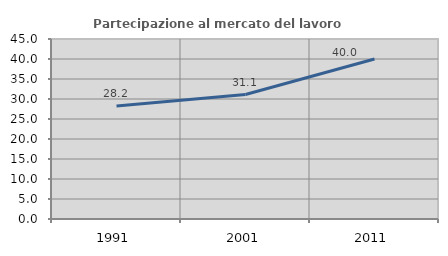
| Category | Partecipazione al mercato del lavoro  femminile |
|---|---|
| 1991.0 | 28.222 |
| 2001.0 | 31.113 |
| 2011.0 | 39.983 |